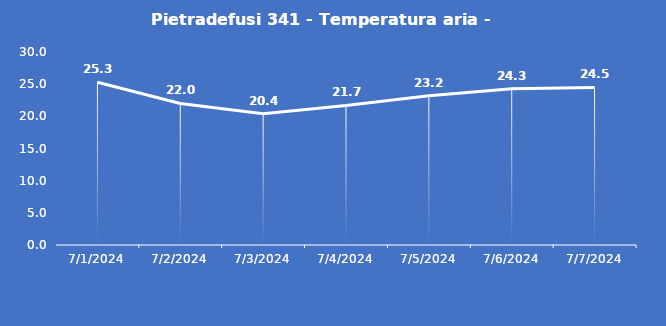
| Category | Pietradefusi 341 - Temperatura aria - Grezzo (°C) |
|---|---|
| 7/1/24 | 25.3 |
| 7/2/24 | 22 |
| 7/3/24 | 20.4 |
| 7/4/24 | 21.7 |
| 7/5/24 | 23.2 |
| 7/6/24 | 24.3 |
| 7/7/24 | 24.5 |